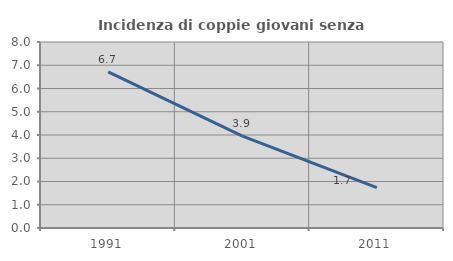
| Category | Incidenza di coppie giovani senza figli |
|---|---|
| 1991.0 | 6.716 |
| 2001.0 | 3.947 |
| 2011.0 | 1.734 |